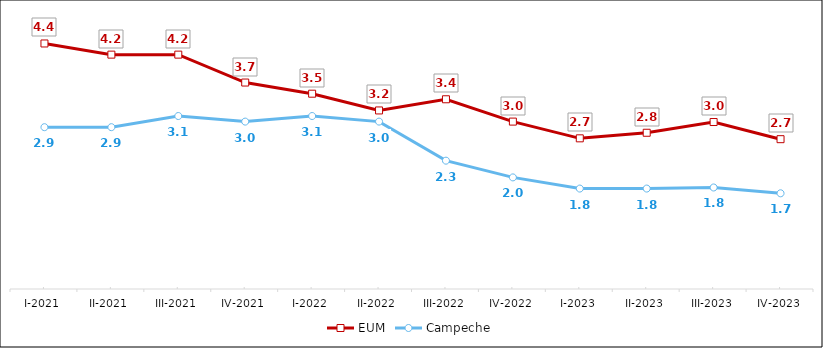
| Category | EUM | Campeche |
|---|---|---|
| I-2021 | 4.4 | 2.9 |
| II-2021 | 4.2 | 2.9 |
| III-2021 | 4.2 | 3.1 |
| IV-2021 | 3.7 | 3 |
| I-2022 | 3.5 | 3.1 |
| II-2022 | 3.2 | 3 |
| III-2022 | 3.4 | 2.3 |
| IV-2022 | 3 | 2 |
| I-2023 | 2.7 | 1.8 |
| II-2023 | 2.8 | 1.8 |
| III-2023 | 2.992 | 1.819 |
| IV-2023 | 2.685 | 1.715 |